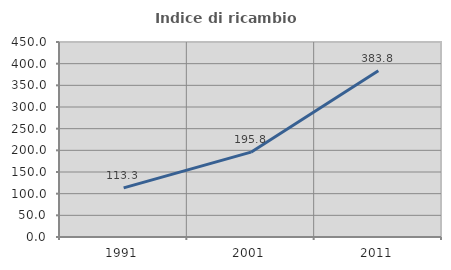
| Category | Indice di ricambio occupazionale  |
|---|---|
| 1991.0 | 113.253 |
| 2001.0 | 195.763 |
| 2011.0 | 383.824 |